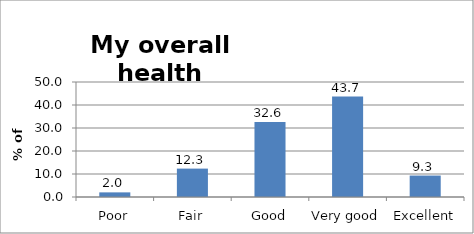
| Category | Series 0 |
|---|---|
| Poor | 2.011 |
| Fair | 12.345 |
| Good | 32.639 |
| Very good | 43.684 |
| Excellent | 9.321 |